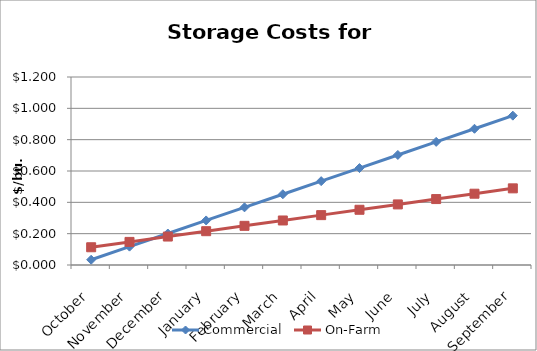
| Category | Commercial | On-Farm |
|---|---|---|
| October | 0.034 | 0.113 |
| November | 0.117 | 0.147 |
| December | 0.201 | 0.182 |
| January | 0.284 | 0.216 |
| February | 0.368 | 0.25 |
| March | 0.452 | 0.284 |
| April | 0.535 | 0.318 |
| May | 0.619 | 0.353 |
| June | 0.702 | 0.387 |
| July | 0.786 | 0.421 |
| August | 0.87 | 0.455 |
| September | 0.953 | 0.489 |